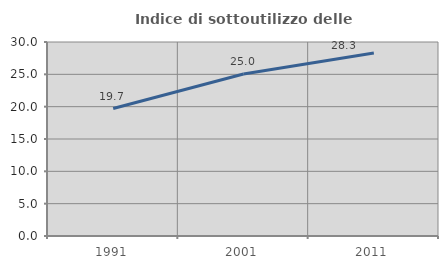
| Category | Indice di sottoutilizzo delle abitazioni  |
|---|---|
| 1991.0 | 19.709 |
| 2001.0 | 25.044 |
| 2011.0 | 28.304 |